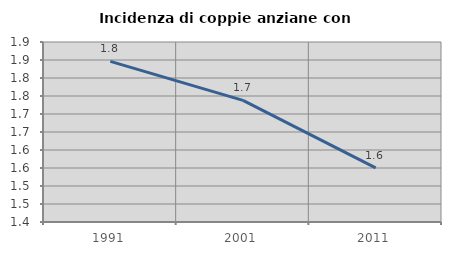
| Category | Incidenza di coppie anziane con figli |
|---|---|
| 1991.0 | 1.846 |
| 2001.0 | 1.738 |
| 2011.0 | 1.55 |